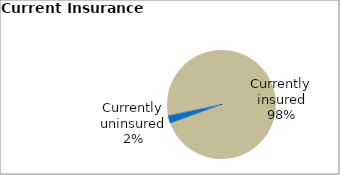
| Category | Series 0 |
|---|---|
| Currently uninsured | 2.246 |
| Currently insured | 97.754 |